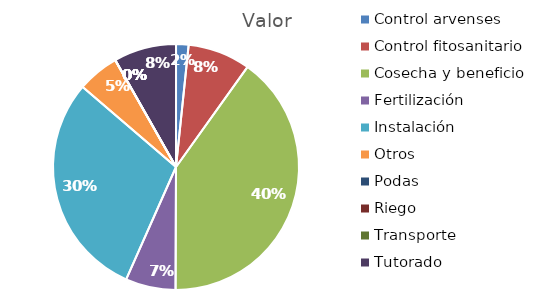
| Category | Valor |
|---|---|
| Control arvenses | 102270 |
| Control fitosanitario | 511350 |
| Cosecha y beneficio | 2495400 |
| Fertilización | 409080 |
| Instalación | 1840860 |
| Otros | 340900 |
| Podas | 0 |
| Riego | 0 |
| Transporte | 0 |
| Tutorado | 511350 |